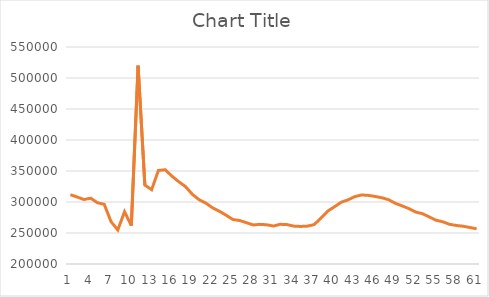
| Category | Series 0 |
|---|---|
| 0 | 311673.419 |
| 1 | 308067.268 |
| 2 | 304014.397 |
| 3 | 306125.525 |
| 4 | 298800.41 |
| 5 | 296255.978 |
| 6 | 268390.59 |
| 7 | 254877.552 |
| 8 | 284338.989 |
| 9 | 261946.01 |
| 10 | 519868.35 |
| 11 | 327306.674 |
| 12 | 319828.19 |
| 13 | 350848.205 |
| 14 | 352051.714 |
| 15 | 341639.789 |
| 16 | 332811.627 |
| 17 | 324862.56 |
| 18 | 312567.818 |
| 19 | 303774.762 |
| 20 | 298332.458 |
| 21 | 290584.094 |
| 22 | 285117.092 |
| 23 | 278708.787 |
| 24 | 271729.107 |
| 25 | 270152.086 |
| 26 | 266650.106 |
| 27 | 262965.757 |
| 28 | 263935.774 |
| 29 | 263235.75 |
| 30 | 261237.424 |
| 31 | 264028.32 |
| 32 | 263513.778 |
| 33 | 261100.084 |
| 34 | 260576.757 |
| 35 | 261050.98 |
| 36 | 263539.558 |
| 37 | 273816.658 |
| 38 | 285170.422 |
| 39 | 292352.354 |
| 40 | 299638.717 |
| 41 | 303481.316 |
| 42 | 308639.086 |
| 43 | 311345.492 |
| 44 | 310720.201 |
| 45 | 308978.289 |
| 46 | 306878.072 |
| 47 | 303680.148 |
| 48 | 297858.702 |
| 49 | 293719.385 |
| 50 | 289338.836 |
| 51 | 283784.461 |
| 52 | 281137.641 |
| 53 | 275984.436 |
| 54 | 270623.335 |
| 55 | 268126.757 |
| 56 | 263988.06 |
| 57 | 262157.902 |
| 58 | 260905.673 |
| 59 | 258917.948 |
| 60 | 256738.671 |